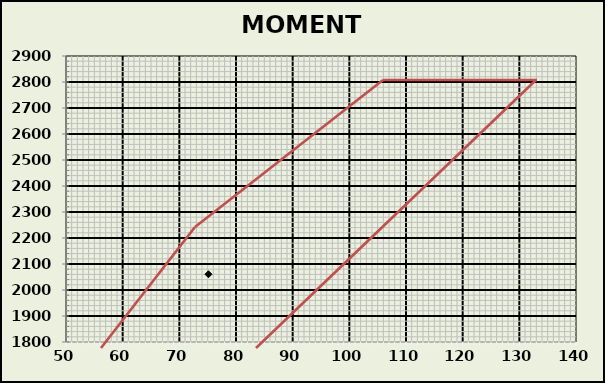
| Category | MOMENT ENVELOPE |
|---|---|
| 75.14408625 | 2060.615 |